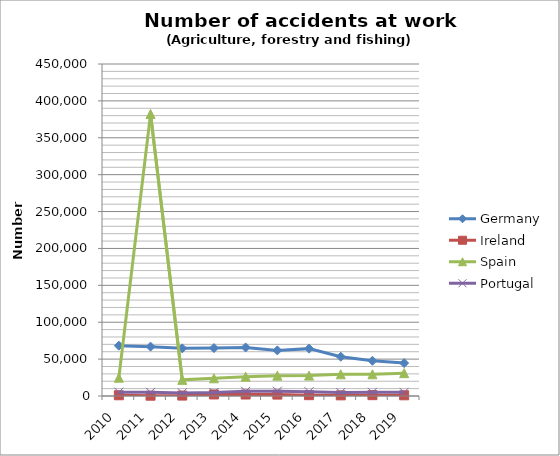
| Category | Germany | Ireland | Spain | Portugal |
|---|---|---|---|---|
| 2010 | 68233 | 1012 | 24781 | 5242 |
| 2011 | 66919 | 407 | 382303 | 4979 |
| 2012 | 64602 | 580 | 21880 | 4227 |
| 2013 | 64981 | 2081 | 23982 | 4795 |
| 2014 | 65815 | 1994 | 26246 | 6333 |
| 2015 | 61840 | 1908 | 27568 | 6586 |
| 2016 | 64207 | 1121 | 27647 | 5813 |
| 2017 | 53209 | 871 | 29384 | 4818 |
| 2018 | 47728 | 1135 | 29424 | 5025 |
| 2019 | 44596 | 968 | 30992 | 4916 |